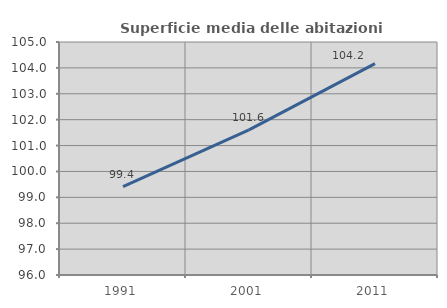
| Category | Superficie media delle abitazioni occupate |
|---|---|
| 1991.0 | 99.413 |
| 2001.0 | 101.603 |
| 2011.0 | 104.168 |